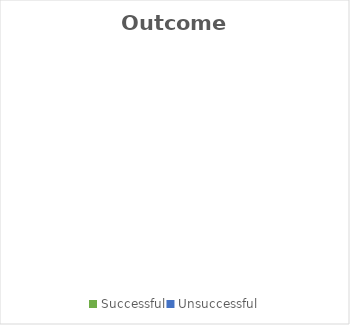
| Category | Series 0 |
|---|---|
| Successful | 0 |
| Unsuccessful | 0 |